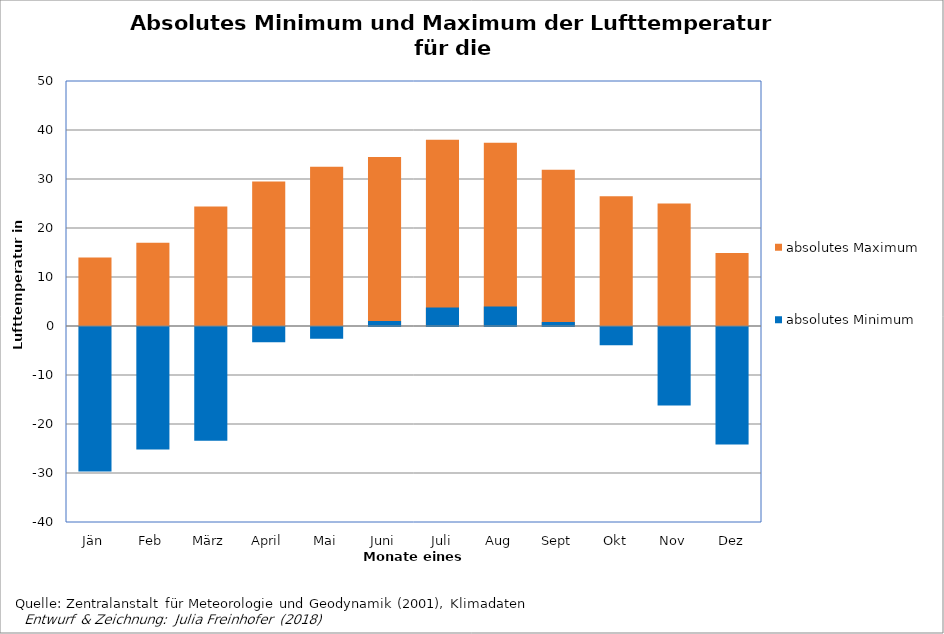
| Category | absolutes Maximum  | absolutes Minimum  |
|---|---|---|
| Jän | 14 | -29.5 |
| Feb | 17 | -25 |
| März | 24.4 | -23.2 |
| April | 29.5 | -3.1 |
| Mai | 32.5 | -2.4 |
| Juni | 34.5 | 1 |
| Juli | 38 | 3.8 |
| Aug | 37.4 | 4 |
| Sept | 31.9 | 0.8 |
| Okt | 26.5 | -3.7 |
| Nov | 25 | -16 |
| Dez | 14.9 | -24 |